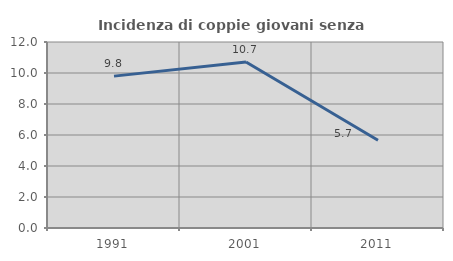
| Category | Incidenza di coppie giovani senza figli |
|---|---|
| 1991.0 | 9.799 |
| 2001.0 | 10.714 |
| 2011.0 | 5.664 |